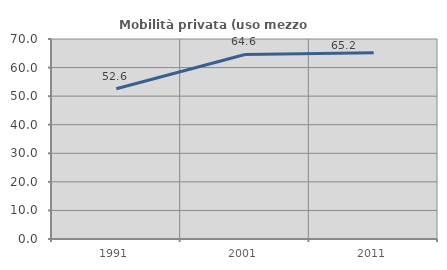
| Category | Mobilità privata (uso mezzo privato) |
|---|---|
| 1991.0 | 52.58 |
| 2001.0 | 64.6 |
| 2011.0 | 65.21 |